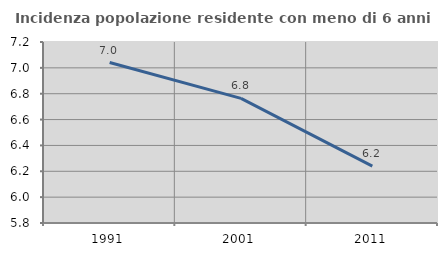
| Category | Incidenza popolazione residente con meno di 6 anni |
|---|---|
| 1991.0 | 7.041 |
| 2001.0 | 6.764 |
| 2011.0 | 6.24 |